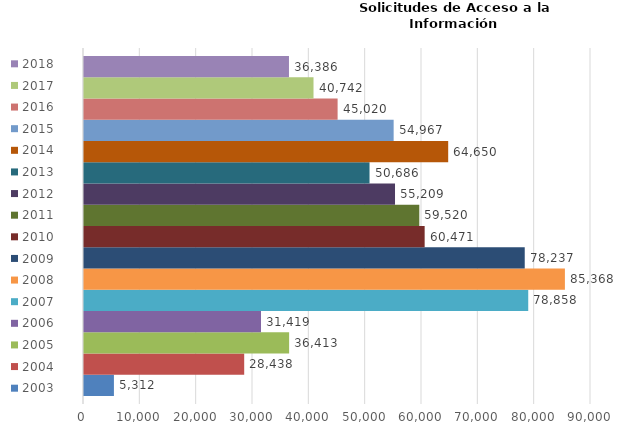
| Category | 2003 | 2004 | 2005 | 2006 | 2007 | 2008 | 2009 | 2010 | 2011 | 2012 | 2013 | 2014 | 2015 | 2016 | 2017 | 2018 |
|---|---|---|---|---|---|---|---|---|---|---|---|---|---|---|---|---|
| 0 | 5312 | 28438 | 36413 | 31419 | 78858 | 85368 | 78237 | 60471 | 59520 | 55209 | 50686 | 64650 | 54967 | 45020 | 40742 | 36386 |